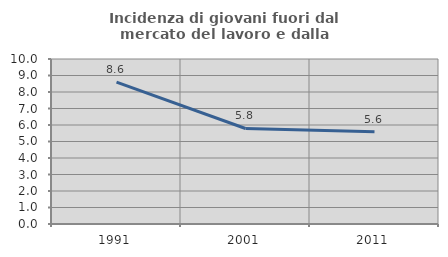
| Category | Incidenza di giovani fuori dal mercato del lavoro e dalla formazione  |
|---|---|
| 1991.0 | 8.602 |
| 2001.0 | 5.789 |
| 2011.0 | 5.594 |